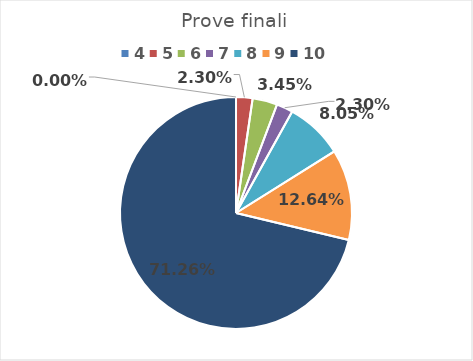
| Category | Series 0 |
|---|---|
| 4.0 | 0 |
| 5.0 | 0.023 |
| 6.0 | 0.034 |
| 7.0 | 0.023 |
| 8.0 | 0.08 |
| 9.0 | 0.126 |
| 10.0 | 0.713 |